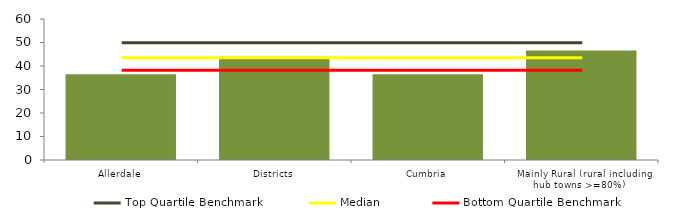
| Category | Block Data |
|---|---|
| Allerdale | 36.5 |
| Districts | 43.927 |
| Cumbria | 36.467 |
|  Mainly Rural (rural including hub towns >=80%)   | 46.612 |